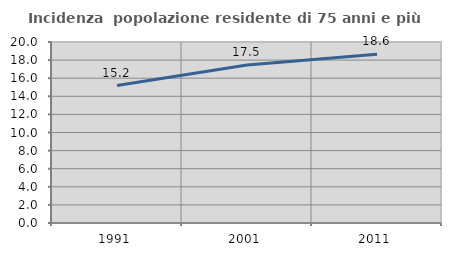
| Category | Incidenza  popolazione residente di 75 anni e più |
|---|---|
| 1991.0 | 15.193 |
| 2001.0 | 17.466 |
| 2011.0 | 18.647 |